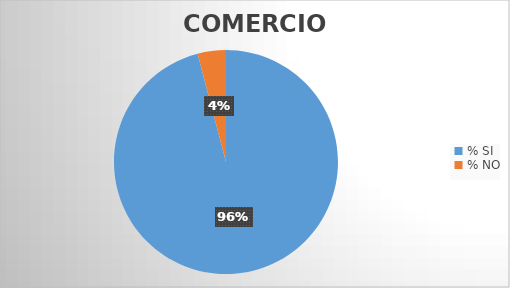
| Category | Series 0 |
|---|---|
| % SI | 95.918 |
| % NO | 4.082 |